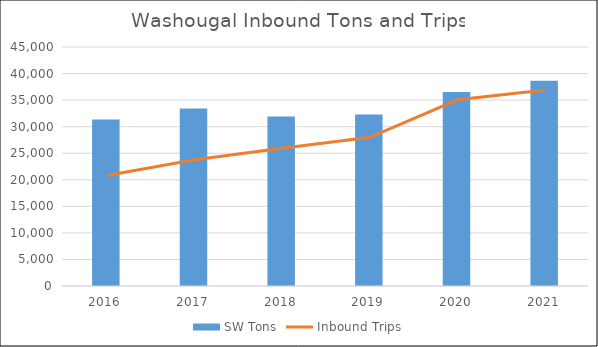
| Category | SW Tons |
|---|---|
| 2016.0 | 31372.44 |
| 2017.0 | 33414.22 |
| 2018.0 | 31919.29 |
| 2019.0 | 32278.32 |
| 2020.0 | 36537.4 |
| 2021.0 | 38638.16 |